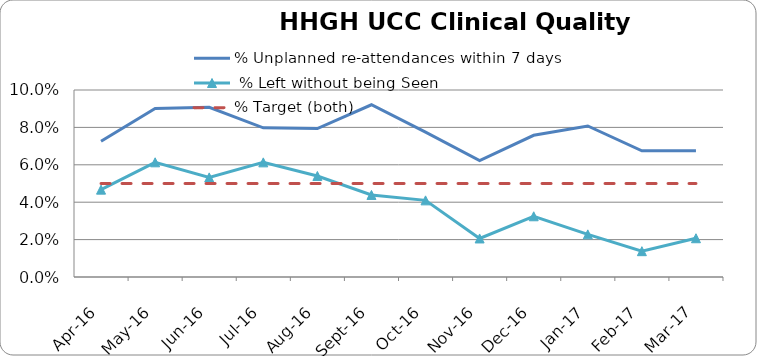
| Category | % Unplanned re-attendances within 7 days | % Left without being Seen | % Target (both) |
|---|---|---|---|
| 2016-04-01 | 0.073 | 0.047 |  |
| 2016-05-01 | 0.09 | 0.061 |  |
| 2016-06-01 | 0.091 | 0.053 |  |
| 2016-07-01 | 0.08 | 0.061 |  |
| 2016-08-01 | 0.079 | 0.054 |  |
| 2016-09-01 | 0.092 | 0.044 |  |
| 2016-10-01 | 0.077 | 0.041 |  |
| 2016-11-01 | 0.062 | 0.021 |  |
| 2016-12-01 | 0.076 | 0.032 |  |
| 2017-01-01 | 0.081 | 0.023 |  |
| 2017-02-01 | 0.068 | 0.014 |  |
| 2017-03-01 | 0.067 | 0.021 |  |